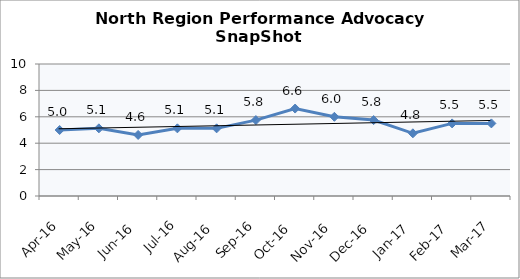
| Category | North Region |
|---|---|
| Apr-16 | 5 |
| May-16 | 5.125 |
| Jun-16 | 4.625 |
| Jul-16 | 5.125 |
| Aug-16 | 5.125 |
| Sep-16 | 5.75 |
| Oct-16 | 6.625 |
| Nov-16 | 6 |
| Dec-16 | 5.75 |
| Jan-17 | 4.75 |
| Feb-17 | 5.5 |
| Mar-17 | 5.5 |